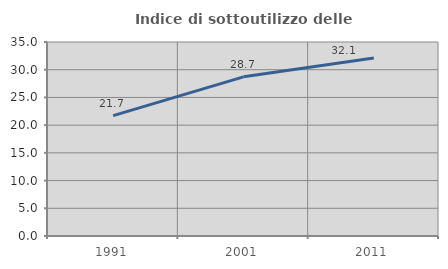
| Category | Indice di sottoutilizzo delle abitazioni  |
|---|---|
| 1991.0 | 21.716 |
| 2001.0 | 28.717 |
| 2011.0 | 32.12 |